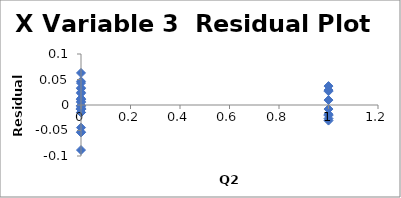
| Category | Series 0 |
|---|---|
| 0.0 | -0.002 |
| 1.0 | 0.037 |
| 0.0 | -0.054 |
| 0.0 | -0.008 |
| 0.0 | 0.032 |
| 1.0 | -0.02 |
| 0.0 | 0.005 |
| 0.0 | 0.046 |
| 0.0 | -0.044 |
| 1.0 | -0.008 |
| 0.0 | -0.015 |
| 0.0 | -0.053 |
| 0.0 | 0.043 |
| 1.0 | 0.027 |
| 0.0 | -0.014 |
| 0.0 | -0.009 |
| 0.0 | 0.023 |
| 1.0 | 0.01 |
| 0.0 | -0.008 |
| 0.0 | 0.025 |
| 0.0 | 0.034 |
| 1.0 | -0.027 |
| 0.0 | 0.007 |
| 0.0 | -0.001 |
| 0.0 | 0.011 |
| 1.0 | -0.018 |
| 0.0 | 0.01 |
| 0.0 | -0.001 |
| 0.0 | -0.008 |
| 1.0 | 0.029 |
| 0.0 | -0.006 |
| 0.0 | 0.063 |
| 0.0 | -0.088 |
| 1.0 | -0.031 |
| 0.0 | 0.013 |